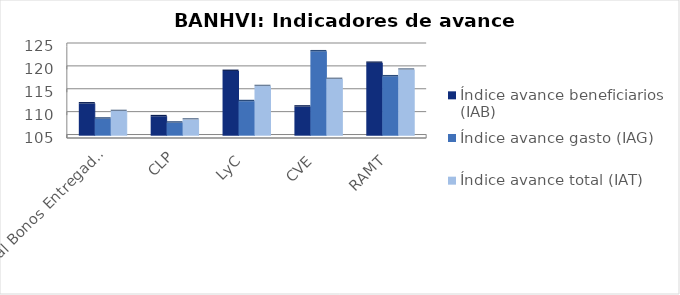
| Category | Índice avance beneficiarios (IAB)  | Índice avance gasto (IAG) | Índice avance total (IAT)  |
|---|---|---|---|
| Total Bonos Entregados | 112.052 | 108.73 | 110.391 |
| CLP | 109.248 | 107.858 | 108.553 |
| LyC | 119.144 | 112.545 | 115.845 |
| CVE | 111.367 | 123.433 | 117.4 |
| RAMT | 120.923 | 117.97 | 119.446 |